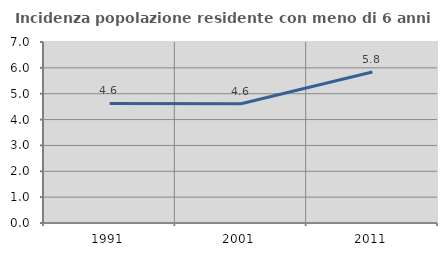
| Category | Incidenza popolazione residente con meno di 6 anni |
|---|---|
| 1991.0 | 4.626 |
| 2001.0 | 4.609 |
| 2011.0 | 5.842 |